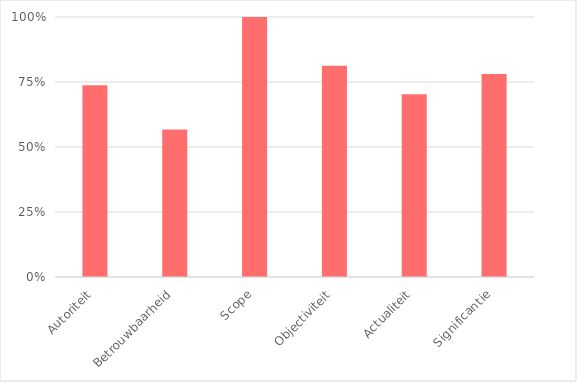
| Category | Series 0 |
|---|---|
| Autoriteit | 0.738 |
| Betrouwbaarheid | 0.567 |
| Scope | 1 |
| Objectiviteit | 0.812 |
| Actualiteit | 0.703 |
| Significantie | 0.781 |